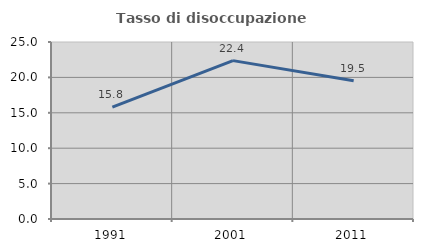
| Category | Tasso di disoccupazione giovanile  |
|---|---|
| 1991.0 | 15.789 |
| 2001.0 | 22.368 |
| 2011.0 | 19.512 |